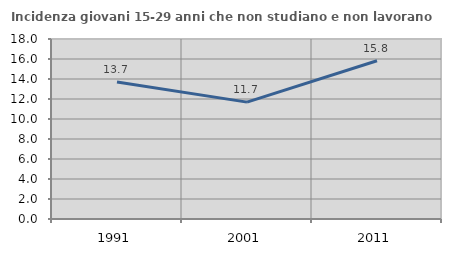
| Category | Incidenza giovani 15-29 anni che non studiano e non lavorano  |
|---|---|
| 1991.0 | 13.699 |
| 2001.0 | 11.688 |
| 2011.0 | 15.83 |